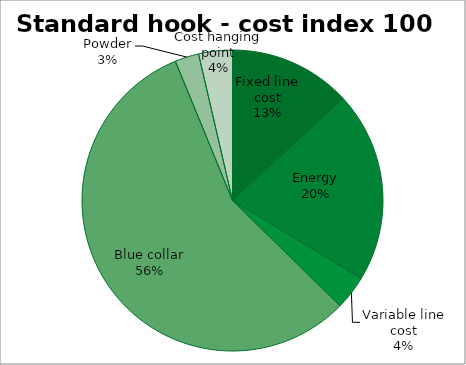
| Category | Fixed line cost |
|---|---|
| Fixed line cost | 0.132 |
| Energy | 0.205 |
| Variable line cost | 0.037 |
| Blue collar | 0.565 |
| Powder | 0.026 |
| Cost hanging point | 0.036 |